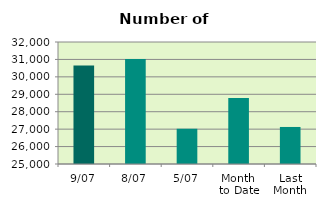
| Category | Series 0 |
|---|---|
| 9/07 | 30654 |
| 8/07 | 31028 |
| 5/07 | 27022 |
| Month 
to Date | 28790.571 |
| Last
Month | 27125.1 |